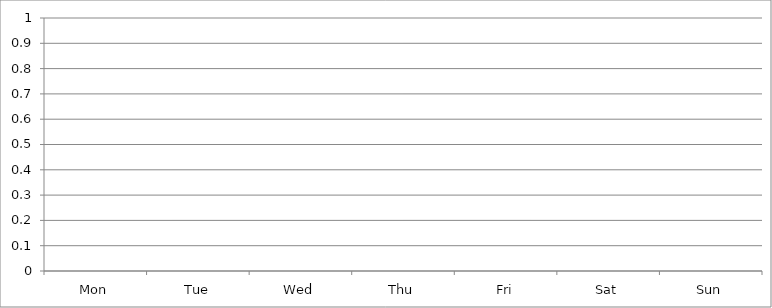
| Category | Series 0 |
|---|---|
| Mon | 0 |
| Tue | 0 |
| Wed | 0 |
| Thu | 0 |
| Fri | 0 |
| Sat | 0 |
| Sun | 0 |